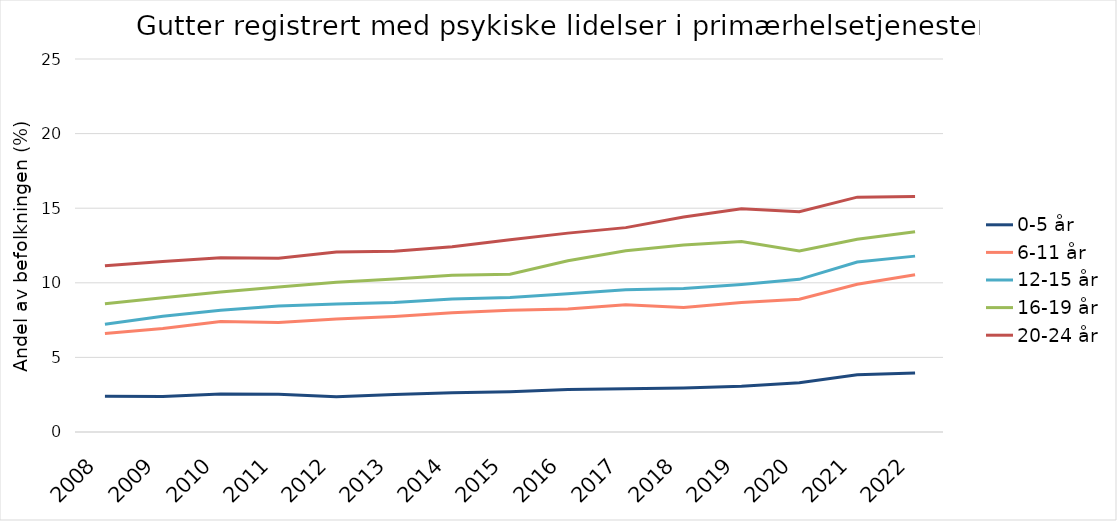
| Category | 0-5 år | 6-11 år | 12-15 år | 16-19 år | 20-24 år |
|---|---|---|---|---|---|
| 2008.0 | 2.395 | 6.6 | 7.219 | 8.602 | 11.135 |
| 2009.0 | 2.385 | 6.935 | 7.756 | 9 | 11.433 |
| 2010.0 | 2.54 | 7.41 | 8.162 | 9.381 | 11.683 |
| 2011.0 | 2.537 | 7.343 | 8.446 | 9.719 | 11.65 |
| 2012.0 | 2.36 | 7.58 | 8.579 | 10.031 | 12.07 |
| 2013.0 | 2.515 | 7.746 | 8.684 | 10.26 | 12.111 |
| 2014.0 | 2.633 | 7.988 | 8.914 | 10.498 | 12.424 |
| 2015.0 | 2.703 | 8.154 | 9.007 | 10.575 | 12.883 |
| 2016.0 | 2.847 | 8.252 | 9.269 | 11.479 | 13.329 |
| 2017.0 | 2.897 | 8.534 | 9.54 | 12.145 | 13.698 |
| 2018.0 | 2.953 | 8.34 | 9.624 | 12.535 | 14.403 |
| 2019.0 | 3.068 | 8.679 | 9.893 | 12.761 | 14.965 |
| 2020.0 | 3.301 | 8.905 | 10.232 | 12.135 | 14.761 |
| 2021.0 | 3.845 | 9.905 | 11.397 | 12.914 | 15.74 |
| 2022.0 | 3.949 | 10.539 | 11.788 | 13.417 | 15.778 |